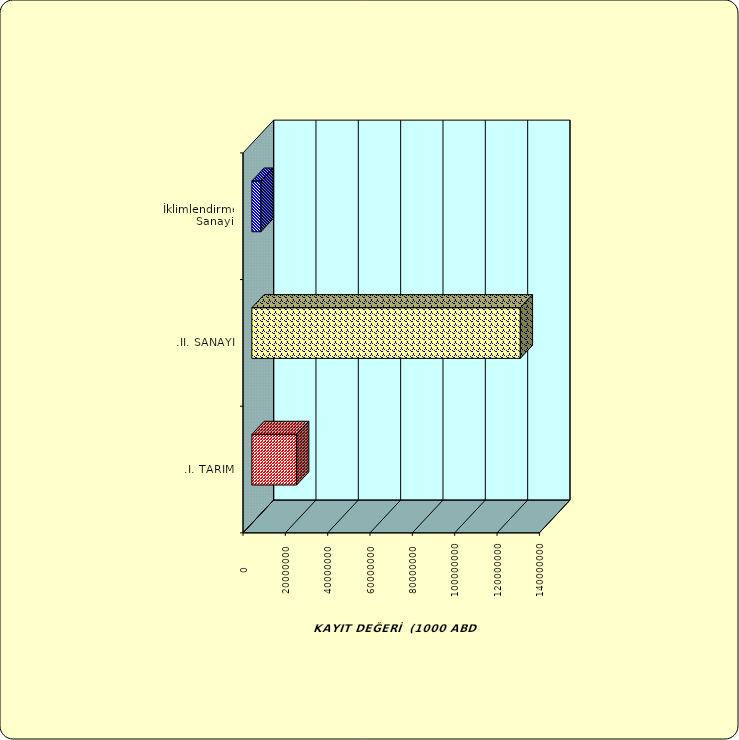
| Category | Series 0 |
|---|---|
| .I. TARIM | 21129375.399 |
| .II. SANAYİ | 126810752.79 |
|  İklimlendirme Sanayii | 4288349.719 |